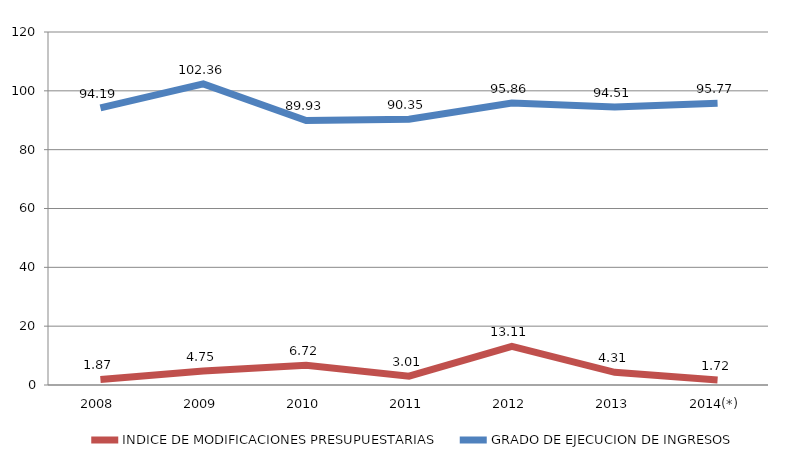
| Category | INDICE DE MODIFICACIONES PRESUPUESTARIAS | GRADO DE EJECUCION DE INGRESOS |
|---|---|---|
| 2008 | 1.871 | 94.189 |
| 2009 | 4.747 | 102.356 |
| 2010 | 6.715 | 89.925 |
| 2011 | 3.011 | 90.354 |
| 2012 | 13.115 | 95.858 |
| 2013 | 4.31 | 94.509 |
| 2014(*) | 1.722 | 95.768 |